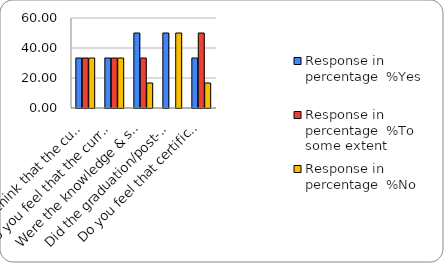
| Category | Response in percentage  |
|---|---|
| Do you think that the curriculum which you had during your graduation/post graduation has provided you with the knowledge & skills necessary to get employed/Self-employed or start own business? | 33.333 |
| Do you feel that the curriculum you studied is helpful in progression to higher studies? | 33.333 |
| Were the knowledge & skills acquired through the curriculum useful to you while working on the job?   | 16.667 |
| Did the graduation/post-graduation programme bring about any attitudinal and behavioural change in you? | 50 |
| Do you feel that certificate/ diploma courses offered by the college in addition to the curriculum lead to better career prospects? | 16.667 |